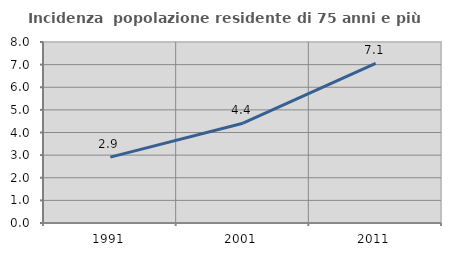
| Category | Incidenza  popolazione residente di 75 anni e più |
|---|---|
| 1991.0 | 2.913 |
| 2001.0 | 4.411 |
| 2011.0 | 7.051 |